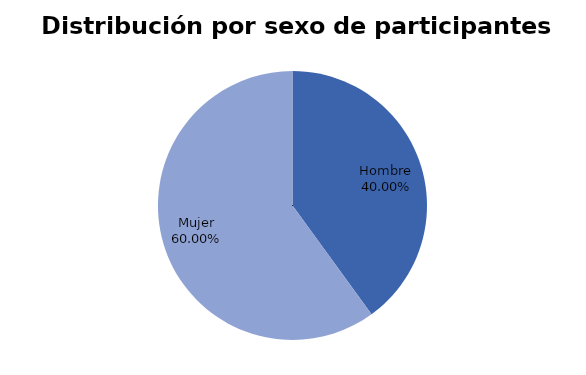
| Category | Series 0 |
|---|---|
| Hombre | 8 |
| Mujer | 12 |